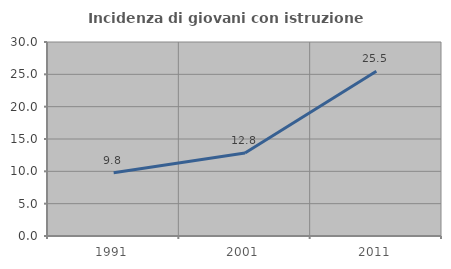
| Category | Incidenza di giovani con istruzione universitaria |
|---|---|
| 1991.0 | 9.783 |
| 2001.0 | 12.829 |
| 2011.0 | 25.461 |